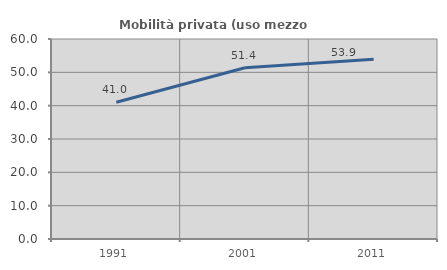
| Category | Mobilità privata (uso mezzo privato) |
|---|---|
| 1991.0 | 41.041 |
| 2001.0 | 51.392 |
| 2011.0 | 53.914 |